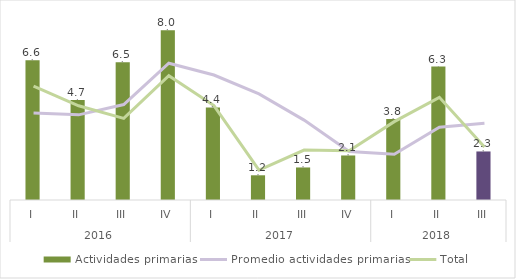
| Category | Actividades primarias |
|---|---|
| 0 | 6.618 |
| 1 | 4.742 |
| 2 | 6.521 |
| 3 | 8.036 |
| 4 | 4.384 |
| 5 | 1.171 |
| 6 | 1.541 |
| 7 | 2.109 |
| 8 | 3.833 |
| 9 | 6.321 |
| 10 | 2.299 |